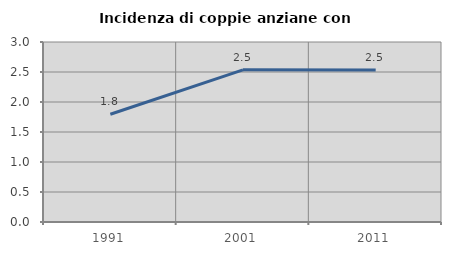
| Category | Incidenza di coppie anziane con figli |
|---|---|
| 1991.0 | 1.796 |
| 2001.0 | 2.537 |
| 2011.0 | 2.533 |